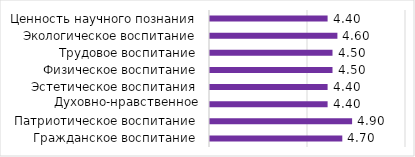
| Category | Средний
 балл |
|---|---|
| Гражданское воспитание | 4.7 |
| Патриотическое воспитание | 4.9 |
| Духовно-нравственное воспитание | 4.4 |
| Эстетическое воспитания | 4.4 |
| Физическое воспитание | 4.5 |
| Трудовое воспитание | 4.5 |
| Экологическое воспитание | 4.6 |
| Ценность научного познания | 4.4 |